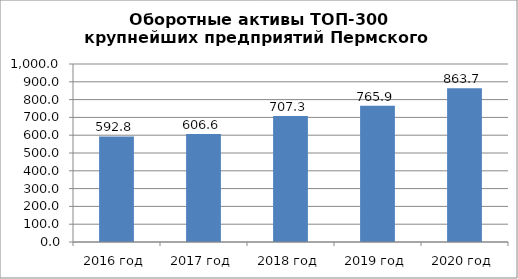
| Category | Оборотные активы |
|---|---|
| 2016 год | 592.8 |
| 2017 год | 606.6 |
| 2018 год | 707.3 |
| 2019 год | 765.9 |
| 2020 год | 863.7 |